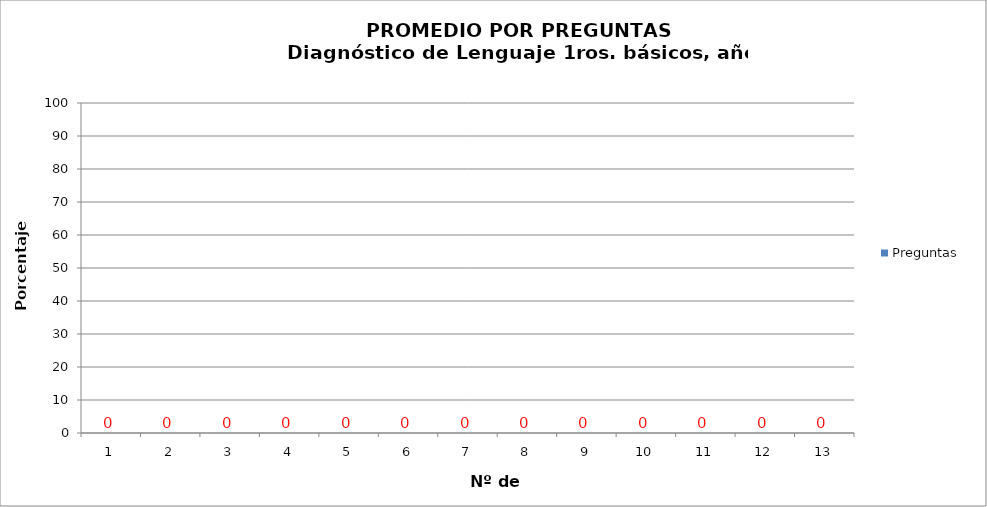
| Category | Preguntas |
|---|---|
| 0 | 0 |
| 1 | 0 |
| 2 | 0 |
| 3 | 0 |
| 4 | 0 |
| 5 | 0 |
| 6 | 0 |
| 7 | 0 |
| 8 | 0 |
| 9 | 0 |
| 10 | 0 |
| 11 | 0 |
| 12 | 0 |